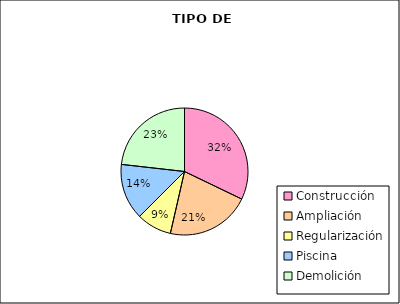
| Category | Series 0 |
|---|---|
| Construcción | 0.321 |
| Ampliación | 0.214 |
| Regularización | 0.089 |
| Piscina | 0.143 |
| Demolición | 0.232 |